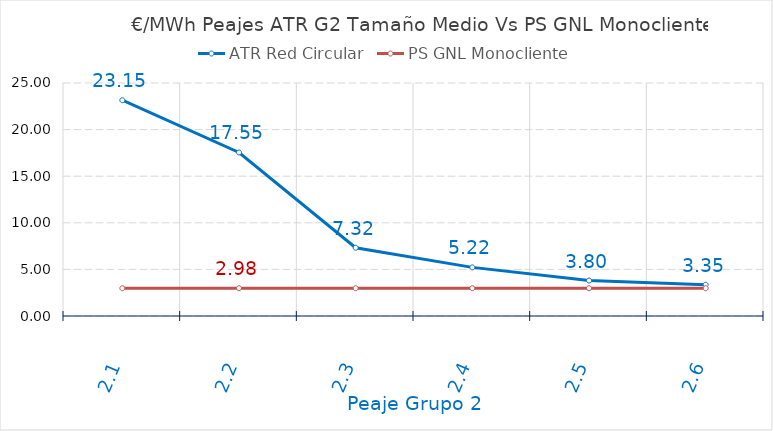
| Category | ATR Red Circular | PS GNL Monocliente |
|---|---|---|
| 2.1 | 23.15 | 2.981 |
| 2.2 | 17.546 | 2.981 |
| 2.3 | 7.322 | 2.981 |
| 2.4 | 5.216 | 2.981 |
| 2.5 | 3.803 | 2.981 |
| 2.6 | 3.351 | 2.981 |